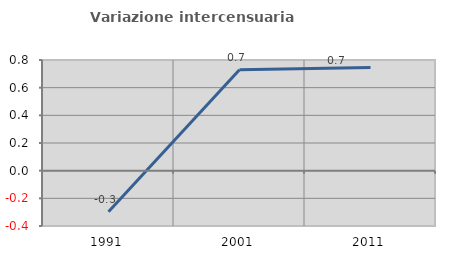
| Category | Variazione intercensuaria annua |
|---|---|
| 1991.0 | -0.297 |
| 2001.0 | 0.73 |
| 2011.0 | 0.746 |